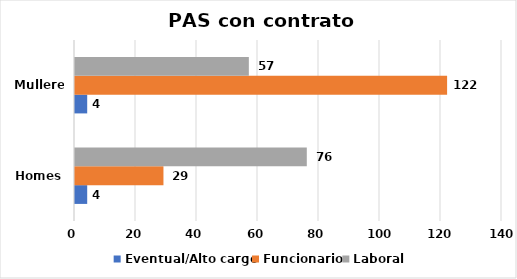
| Category | Eventual/Alto cargo | Funcionario | Laboral |
|---|---|---|---|
| Homes | 4 | 29 | 76 |
| Mulleres | 4 | 122 | 57 |